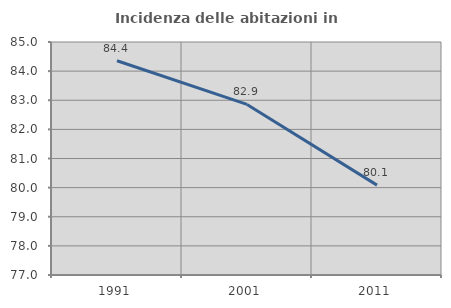
| Category | Incidenza delle abitazioni in proprietà  |
|---|---|
| 1991.0 | 84.358 |
| 2001.0 | 82.857 |
| 2011.0 | 80.087 |